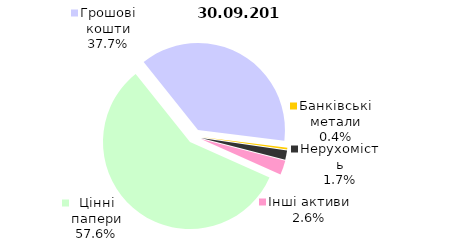
| Category | 30.09.2018 |
|---|---|
| Цінні папери | 1527.1 |
| Грошові кошти | 999.2 |
| Банківські метали | 9.4 |
| Нерухомість | 45.5 |
| Інші активи | 70.1 |